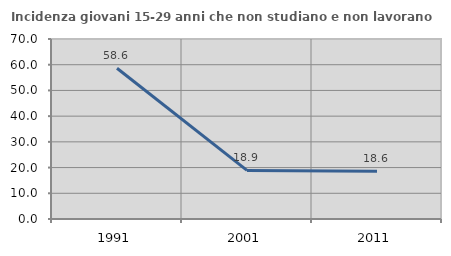
| Category | Incidenza giovani 15-29 anni che non studiano e non lavorano  |
|---|---|
| 1991.0 | 58.615 |
| 2001.0 | 18.884 |
| 2011.0 | 18.579 |